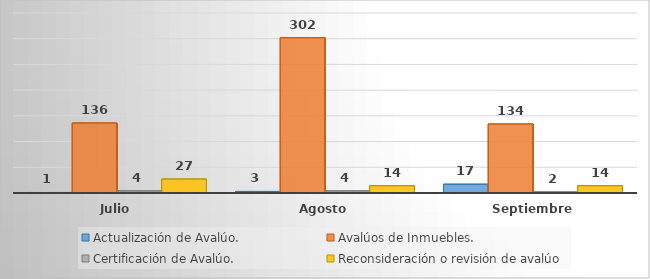
| Category | Actualización de Avalúo. | Avalúos de Inmuebles. | Certificación de Avalúo. | Reconsideración o revisión de avalúo |
|---|---|---|---|---|
| Julio | 1 | 136 | 4 | 27 |
| Agosto | 3 | 302 | 4 | 14 |
| Septiembre | 17 | 134 | 2 | 14 |